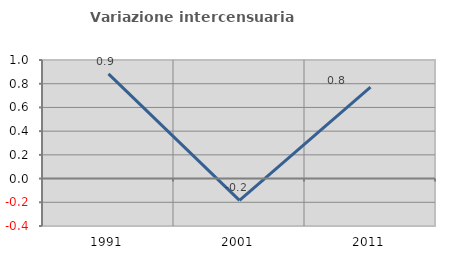
| Category | Variazione intercensuaria annua |
|---|---|
| 1991.0 | 0.883 |
| 2001.0 | -0.184 |
| 2011.0 | 0.771 |